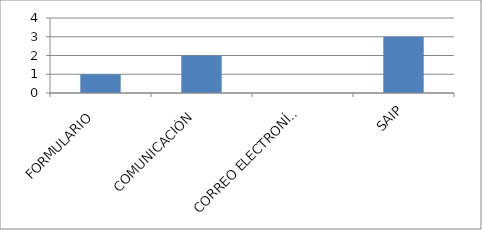
| Category | Series 0 |
|---|---|
| FORMULARIO  | 1 |
| COMUNICACIÓN  | 2 |
| CORREO ELECTRONÍCO  | 0 |
| SAIP | 3 |